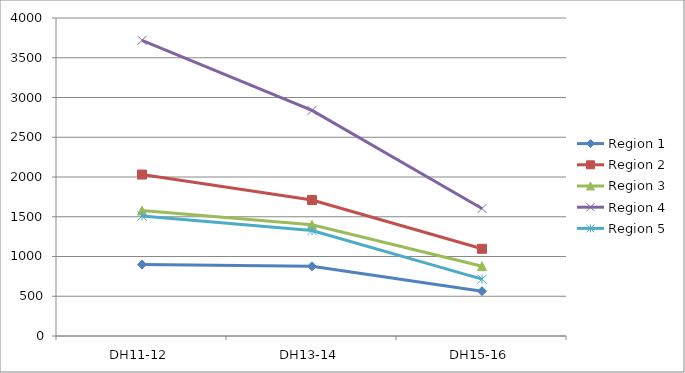
| Category | Region 1 | Region 2 | Region 3 | Region 4 | Region 5 |
|---|---|---|---|---|---|
| DH11-12 | 898 | 2031 | 1578 | 3719 | 1510 |
| DH13-14 | 876 | 1710 | 1398 | 2837 | 1326 |
| DH15-16 | 564 | 1097 | 878 | 1604 | 715 |